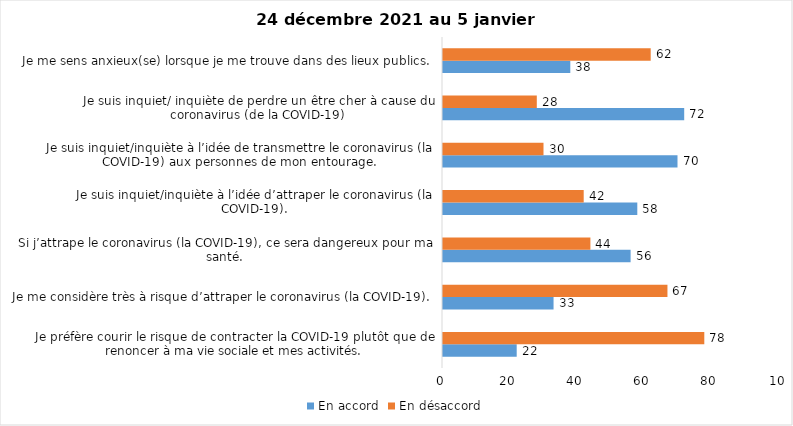
| Category | En accord | En désaccord |
|---|---|---|
| Je préfère courir le risque de contracter la COVID-19 plutôt que de renoncer à ma vie sociale et mes activités. | 22 | 78 |
| Je me considère très à risque d’attraper le coronavirus (la COVID-19). | 33 | 67 |
| Si j’attrape le coronavirus (la COVID-19), ce sera dangereux pour ma santé. | 56 | 44 |
| Je suis inquiet/inquiète à l’idée d’attraper le coronavirus (la COVID-19). | 58 | 42 |
| Je suis inquiet/inquiète à l’idée de transmettre le coronavirus (la COVID-19) aux personnes de mon entourage. | 70 | 30 |
| Je suis inquiet/ inquiète de perdre un être cher à cause du coronavirus (de la COVID-19) | 72 | 28 |
| Je me sens anxieux(se) lorsque je me trouve dans des lieux publics. | 38 | 62 |